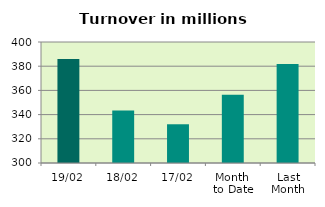
| Category | Series 0 |
|---|---|
| 19/02 | 386.045 |
| 18/02 | 343.328 |
| 17/02 | 332.013 |
| Month 
to Date | 356.37 |
| Last
Month | 381.872 |